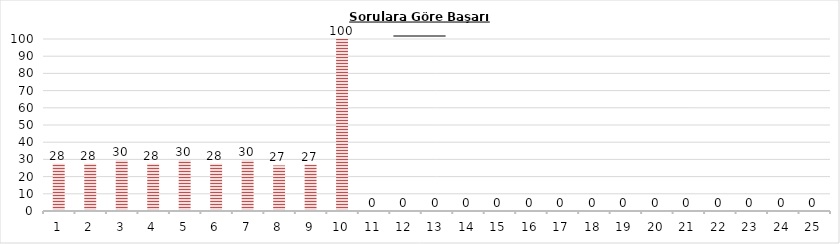
| Category | Series 0 |
|---|---|
| 0 | 27.5 |
| 1 | 27.5 |
| 2 | 29.5 |
| 3 | 27.5 |
| 4 | 29.5 |
| 5 | 27.5 |
| 6 | 29.5 |
| 7 | 26.5 |
| 8 | 27 |
| 9 | 100 |
| 10 | 0 |
| 11 | 0 |
| 12 | 0 |
| 13 | 0 |
| 14 | 0 |
| 15 | 0 |
| 16 | 0 |
| 17 | 0 |
| 18 | 0 |
| 19 | 0 |
| 20 | 0 |
| 21 | 0 |
| 22 | 0 |
| 23 | 0 |
| 24 | 0 |